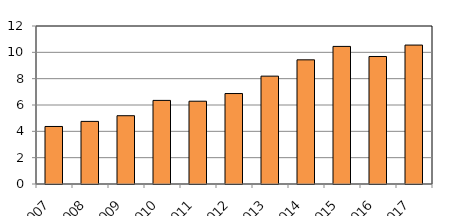
| Category | Series 1 |
|---|---|
| 2007 | 4369 |
| 2008 | 4755 |
| 2009 | 5186 |
| 2010 | 6350 |
| 2011 | 6288 |
| 2012 | 6870 |
| 2013 | 8191 |
| 2014 | 9430 |
| 2015 | 10450 |
| 2016 | 9684 |
| 2017 | 10552 |